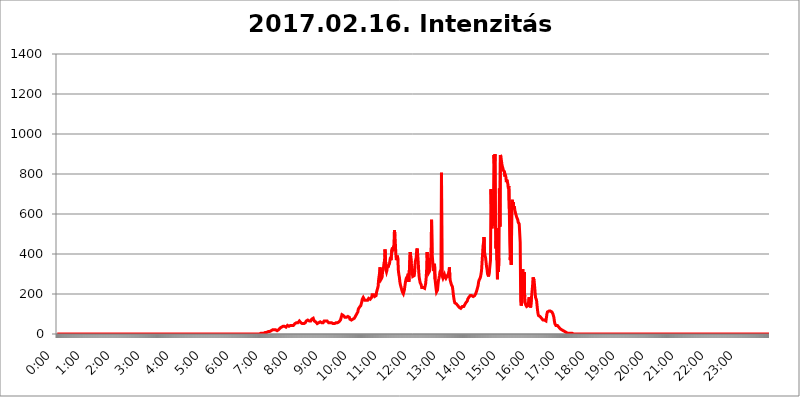
| Category | 2017.02.16. Intenzitás [W/m^2] |
|---|---|
| 0.0 | 0 |
| 0.0006944444444444445 | 0 |
| 0.001388888888888889 | 0 |
| 0.0020833333333333333 | 0 |
| 0.002777777777777778 | 0 |
| 0.003472222222222222 | 0 |
| 0.004166666666666667 | 0 |
| 0.004861111111111111 | 0 |
| 0.005555555555555556 | 0 |
| 0.0062499999999999995 | 0 |
| 0.006944444444444444 | 0 |
| 0.007638888888888889 | 0 |
| 0.008333333333333333 | 0 |
| 0.009027777777777779 | 0 |
| 0.009722222222222222 | 0 |
| 0.010416666666666666 | 0 |
| 0.011111111111111112 | 0 |
| 0.011805555555555555 | 0 |
| 0.012499999999999999 | 0 |
| 0.013194444444444444 | 0 |
| 0.013888888888888888 | 0 |
| 0.014583333333333332 | 0 |
| 0.015277777777777777 | 0 |
| 0.015972222222222224 | 0 |
| 0.016666666666666666 | 0 |
| 0.017361111111111112 | 0 |
| 0.018055555555555557 | 0 |
| 0.01875 | 0 |
| 0.019444444444444445 | 0 |
| 0.02013888888888889 | 0 |
| 0.020833333333333332 | 0 |
| 0.02152777777777778 | 0 |
| 0.022222222222222223 | 0 |
| 0.02291666666666667 | 0 |
| 0.02361111111111111 | 0 |
| 0.024305555555555556 | 0 |
| 0.024999999999999998 | 0 |
| 0.025694444444444447 | 0 |
| 0.02638888888888889 | 0 |
| 0.027083333333333334 | 0 |
| 0.027777777777777776 | 0 |
| 0.02847222222222222 | 0 |
| 0.029166666666666664 | 0 |
| 0.029861111111111113 | 0 |
| 0.030555555555555555 | 0 |
| 0.03125 | 0 |
| 0.03194444444444445 | 0 |
| 0.03263888888888889 | 0 |
| 0.03333333333333333 | 0 |
| 0.034027777777777775 | 0 |
| 0.034722222222222224 | 0 |
| 0.035416666666666666 | 0 |
| 0.036111111111111115 | 0 |
| 0.03680555555555556 | 0 |
| 0.0375 | 0 |
| 0.03819444444444444 | 0 |
| 0.03888888888888889 | 0 |
| 0.03958333333333333 | 0 |
| 0.04027777777777778 | 0 |
| 0.04097222222222222 | 0 |
| 0.041666666666666664 | 0 |
| 0.042361111111111106 | 0 |
| 0.04305555555555556 | 0 |
| 0.043750000000000004 | 0 |
| 0.044444444444444446 | 0 |
| 0.04513888888888889 | 0 |
| 0.04583333333333334 | 0 |
| 0.04652777777777778 | 0 |
| 0.04722222222222222 | 0 |
| 0.04791666666666666 | 0 |
| 0.04861111111111111 | 0 |
| 0.049305555555555554 | 0 |
| 0.049999999999999996 | 0 |
| 0.05069444444444445 | 0 |
| 0.051388888888888894 | 0 |
| 0.052083333333333336 | 0 |
| 0.05277777777777778 | 0 |
| 0.05347222222222222 | 0 |
| 0.05416666666666667 | 0 |
| 0.05486111111111111 | 0 |
| 0.05555555555555555 | 0 |
| 0.05625 | 0 |
| 0.05694444444444444 | 0 |
| 0.057638888888888885 | 0 |
| 0.05833333333333333 | 0 |
| 0.05902777777777778 | 0 |
| 0.059722222222222225 | 0 |
| 0.06041666666666667 | 0 |
| 0.061111111111111116 | 0 |
| 0.06180555555555556 | 0 |
| 0.0625 | 0 |
| 0.06319444444444444 | 0 |
| 0.06388888888888888 | 0 |
| 0.06458333333333334 | 0 |
| 0.06527777777777778 | 0 |
| 0.06597222222222222 | 0 |
| 0.06666666666666667 | 0 |
| 0.06736111111111111 | 0 |
| 0.06805555555555555 | 0 |
| 0.06874999999999999 | 0 |
| 0.06944444444444443 | 0 |
| 0.07013888888888889 | 0 |
| 0.07083333333333333 | 0 |
| 0.07152777777777779 | 0 |
| 0.07222222222222223 | 0 |
| 0.07291666666666667 | 0 |
| 0.07361111111111111 | 0 |
| 0.07430555555555556 | 0 |
| 0.075 | 0 |
| 0.07569444444444444 | 0 |
| 0.0763888888888889 | 0 |
| 0.07708333333333334 | 0 |
| 0.07777777777777778 | 0 |
| 0.07847222222222222 | 0 |
| 0.07916666666666666 | 0 |
| 0.0798611111111111 | 0 |
| 0.08055555555555556 | 0 |
| 0.08125 | 0 |
| 0.08194444444444444 | 0 |
| 0.08263888888888889 | 0 |
| 0.08333333333333333 | 0 |
| 0.08402777777777777 | 0 |
| 0.08472222222222221 | 0 |
| 0.08541666666666665 | 0 |
| 0.08611111111111112 | 0 |
| 0.08680555555555557 | 0 |
| 0.08750000000000001 | 0 |
| 0.08819444444444445 | 0 |
| 0.08888888888888889 | 0 |
| 0.08958333333333333 | 0 |
| 0.09027777777777778 | 0 |
| 0.09097222222222222 | 0 |
| 0.09166666666666667 | 0 |
| 0.09236111111111112 | 0 |
| 0.09305555555555556 | 0 |
| 0.09375 | 0 |
| 0.09444444444444444 | 0 |
| 0.09513888888888888 | 0 |
| 0.09583333333333333 | 0 |
| 0.09652777777777777 | 0 |
| 0.09722222222222222 | 0 |
| 0.09791666666666667 | 0 |
| 0.09861111111111111 | 0 |
| 0.09930555555555555 | 0 |
| 0.09999999999999999 | 0 |
| 0.10069444444444443 | 0 |
| 0.1013888888888889 | 0 |
| 0.10208333333333335 | 0 |
| 0.10277777777777779 | 0 |
| 0.10347222222222223 | 0 |
| 0.10416666666666667 | 0 |
| 0.10486111111111111 | 0 |
| 0.10555555555555556 | 0 |
| 0.10625 | 0 |
| 0.10694444444444444 | 0 |
| 0.1076388888888889 | 0 |
| 0.10833333333333334 | 0 |
| 0.10902777777777778 | 0 |
| 0.10972222222222222 | 0 |
| 0.1111111111111111 | 0 |
| 0.11180555555555556 | 0 |
| 0.11180555555555556 | 0 |
| 0.1125 | 0 |
| 0.11319444444444444 | 0 |
| 0.11388888888888889 | 0 |
| 0.11458333333333333 | 0 |
| 0.11527777777777777 | 0 |
| 0.11597222222222221 | 0 |
| 0.11666666666666665 | 0 |
| 0.1173611111111111 | 0 |
| 0.11805555555555557 | 0 |
| 0.11944444444444445 | 0 |
| 0.12013888888888889 | 0 |
| 0.12083333333333333 | 0 |
| 0.12152777777777778 | 0 |
| 0.12222222222222223 | 0 |
| 0.12291666666666667 | 0 |
| 0.12291666666666667 | 0 |
| 0.12361111111111112 | 0 |
| 0.12430555555555556 | 0 |
| 0.125 | 0 |
| 0.12569444444444444 | 0 |
| 0.12638888888888888 | 0 |
| 0.12708333333333333 | 0 |
| 0.16875 | 0 |
| 0.12847222222222224 | 0 |
| 0.12916666666666668 | 0 |
| 0.12986111111111112 | 0 |
| 0.13055555555555556 | 0 |
| 0.13125 | 0 |
| 0.13194444444444445 | 0 |
| 0.1326388888888889 | 0 |
| 0.13333333333333333 | 0 |
| 0.13402777777777777 | 0 |
| 0.13402777777777777 | 0 |
| 0.13472222222222222 | 0 |
| 0.13541666666666666 | 0 |
| 0.1361111111111111 | 0 |
| 0.13749999999999998 | 0 |
| 0.13819444444444443 | 0 |
| 0.1388888888888889 | 0 |
| 0.13958333333333334 | 0 |
| 0.14027777777777778 | 0 |
| 0.14097222222222222 | 0 |
| 0.14166666666666666 | 0 |
| 0.1423611111111111 | 0 |
| 0.14305555555555557 | 0 |
| 0.14375000000000002 | 0 |
| 0.14444444444444446 | 0 |
| 0.1451388888888889 | 0 |
| 0.1451388888888889 | 0 |
| 0.14652777777777778 | 0 |
| 0.14722222222222223 | 0 |
| 0.14791666666666667 | 0 |
| 0.1486111111111111 | 0 |
| 0.14930555555555555 | 0 |
| 0.15 | 0 |
| 0.15069444444444444 | 0 |
| 0.15138888888888888 | 0 |
| 0.15208333333333332 | 0 |
| 0.15277777777777776 | 0 |
| 0.15347222222222223 | 0 |
| 0.15416666666666667 | 0 |
| 0.15486111111111112 | 0 |
| 0.15555555555555556 | 0 |
| 0.15625 | 0 |
| 0.15694444444444444 | 0 |
| 0.15763888888888888 | 0 |
| 0.15833333333333333 | 0 |
| 0.15902777777777777 | 0 |
| 0.15972222222222224 | 0 |
| 0.16041666666666668 | 0 |
| 0.16111111111111112 | 0 |
| 0.16180555555555556 | 0 |
| 0.1625 | 0 |
| 0.16319444444444445 | 0 |
| 0.1638888888888889 | 0 |
| 0.16458333333333333 | 0 |
| 0.16527777777777777 | 0 |
| 0.16597222222222222 | 0 |
| 0.16666666666666666 | 0 |
| 0.1673611111111111 | 0 |
| 0.16805555555555554 | 0 |
| 0.16874999999999998 | 0 |
| 0.16944444444444443 | 0 |
| 0.17013888888888887 | 0 |
| 0.1708333333333333 | 0 |
| 0.17152777777777775 | 0 |
| 0.17222222222222225 | 0 |
| 0.1729166666666667 | 0 |
| 0.17361111111111113 | 0 |
| 0.17430555555555557 | 0 |
| 0.17500000000000002 | 0 |
| 0.17569444444444446 | 0 |
| 0.1763888888888889 | 0 |
| 0.17708333333333334 | 0 |
| 0.17777777777777778 | 0 |
| 0.17847222222222223 | 0 |
| 0.17916666666666667 | 0 |
| 0.1798611111111111 | 0 |
| 0.18055555555555555 | 0 |
| 0.18125 | 0 |
| 0.18194444444444444 | 0 |
| 0.1826388888888889 | 0 |
| 0.18333333333333335 | 0 |
| 0.1840277777777778 | 0 |
| 0.18472222222222223 | 0 |
| 0.18541666666666667 | 0 |
| 0.18611111111111112 | 0 |
| 0.18680555555555556 | 0 |
| 0.1875 | 0 |
| 0.18819444444444444 | 0 |
| 0.18888888888888888 | 0 |
| 0.18958333333333333 | 0 |
| 0.19027777777777777 | 0 |
| 0.1909722222222222 | 0 |
| 0.19166666666666665 | 0 |
| 0.19236111111111112 | 0 |
| 0.19305555555555554 | 0 |
| 0.19375 | 0 |
| 0.19444444444444445 | 0 |
| 0.1951388888888889 | 0 |
| 0.19583333333333333 | 0 |
| 0.19652777777777777 | 0 |
| 0.19722222222222222 | 0 |
| 0.19791666666666666 | 0 |
| 0.1986111111111111 | 0 |
| 0.19930555555555554 | 0 |
| 0.19999999999999998 | 0 |
| 0.20069444444444443 | 0 |
| 0.20138888888888887 | 0 |
| 0.2020833333333333 | 0 |
| 0.2027777777777778 | 0 |
| 0.2034722222222222 | 0 |
| 0.2041666666666667 | 0 |
| 0.20486111111111113 | 0 |
| 0.20555555555555557 | 0 |
| 0.20625000000000002 | 0 |
| 0.20694444444444446 | 0 |
| 0.2076388888888889 | 0 |
| 0.20833333333333334 | 0 |
| 0.20902777777777778 | 0 |
| 0.20972222222222223 | 0 |
| 0.21041666666666667 | 0 |
| 0.2111111111111111 | 0 |
| 0.21180555555555555 | 0 |
| 0.2125 | 0 |
| 0.21319444444444444 | 0 |
| 0.2138888888888889 | 0 |
| 0.21458333333333335 | 0 |
| 0.2152777777777778 | 0 |
| 0.21597222222222223 | 0 |
| 0.21666666666666667 | 0 |
| 0.21736111111111112 | 0 |
| 0.21805555555555556 | 0 |
| 0.21875 | 0 |
| 0.21944444444444444 | 0 |
| 0.22013888888888888 | 0 |
| 0.22083333333333333 | 0 |
| 0.22152777777777777 | 0 |
| 0.2222222222222222 | 0 |
| 0.22291666666666665 | 0 |
| 0.2236111111111111 | 0 |
| 0.22430555555555556 | 0 |
| 0.225 | 0 |
| 0.22569444444444445 | 0 |
| 0.2263888888888889 | 0 |
| 0.22708333333333333 | 0 |
| 0.22777777777777777 | 0 |
| 0.22847222222222222 | 0 |
| 0.22916666666666666 | 0 |
| 0.2298611111111111 | 0 |
| 0.23055555555555554 | 0 |
| 0.23124999999999998 | 0 |
| 0.23194444444444443 | 0 |
| 0.23263888888888887 | 0 |
| 0.2333333333333333 | 0 |
| 0.2340277777777778 | 0 |
| 0.2347222222222222 | 0 |
| 0.2354166666666667 | 0 |
| 0.23611111111111113 | 0 |
| 0.23680555555555557 | 0 |
| 0.23750000000000002 | 0 |
| 0.23819444444444446 | 0 |
| 0.2388888888888889 | 0 |
| 0.23958333333333334 | 0 |
| 0.24027777777777778 | 0 |
| 0.24097222222222223 | 0 |
| 0.24166666666666667 | 0 |
| 0.2423611111111111 | 0 |
| 0.24305555555555555 | 0 |
| 0.24375 | 0 |
| 0.24444444444444446 | 0 |
| 0.24513888888888888 | 0 |
| 0.24583333333333335 | 0 |
| 0.2465277777777778 | 0 |
| 0.24722222222222223 | 0 |
| 0.24791666666666667 | 0 |
| 0.24861111111111112 | 0 |
| 0.24930555555555556 | 0 |
| 0.25 | 0 |
| 0.25069444444444444 | 0 |
| 0.2513888888888889 | 0 |
| 0.2520833333333333 | 0 |
| 0.25277777777777777 | 0 |
| 0.2534722222222222 | 0 |
| 0.25416666666666665 | 0 |
| 0.2548611111111111 | 0 |
| 0.2555555555555556 | 0 |
| 0.25625000000000003 | 0 |
| 0.2569444444444445 | 0 |
| 0.2576388888888889 | 0 |
| 0.25833333333333336 | 0 |
| 0.2590277777777778 | 0 |
| 0.25972222222222224 | 0 |
| 0.2604166666666667 | 0 |
| 0.2611111111111111 | 0 |
| 0.26180555555555557 | 0 |
| 0.2625 | 0 |
| 0.26319444444444445 | 0 |
| 0.2638888888888889 | 0 |
| 0.26458333333333334 | 0 |
| 0.2652777777777778 | 0 |
| 0.2659722222222222 | 0 |
| 0.26666666666666666 | 0 |
| 0.2673611111111111 | 0 |
| 0.26805555555555555 | 0 |
| 0.26875 | 0 |
| 0.26944444444444443 | 0 |
| 0.2701388888888889 | 0 |
| 0.2708333333333333 | 0 |
| 0.27152777777777776 | 0 |
| 0.2722222222222222 | 0 |
| 0.27291666666666664 | 0 |
| 0.2736111111111111 | 0 |
| 0.2743055555555555 | 0 |
| 0.27499999999999997 | 0 |
| 0.27569444444444446 | 0 |
| 0.27638888888888885 | 0 |
| 0.27708333333333335 | 0 |
| 0.2777777777777778 | 0 |
| 0.27847222222222223 | 0 |
| 0.2791666666666667 | 0 |
| 0.2798611111111111 | 0 |
| 0.28055555555555556 | 0 |
| 0.28125 | 0 |
| 0.28194444444444444 | 0 |
| 0.2826388888888889 | 0 |
| 0.2833333333333333 | 0 |
| 0.28402777777777777 | 3.525 |
| 0.2847222222222222 | 0 |
| 0.28541666666666665 | 3.525 |
| 0.28611111111111115 | 3.525 |
| 0.28680555555555554 | 3.525 |
| 0.28750000000000003 | 3.525 |
| 0.2881944444444445 | 3.525 |
| 0.2888888888888889 | 3.525 |
| 0.28958333333333336 | 3.525 |
| 0.2902777777777778 | 3.525 |
| 0.29097222222222224 | 7.887 |
| 0.2916666666666667 | 7.887 |
| 0.2923611111111111 | 7.887 |
| 0.29305555555555557 | 7.887 |
| 0.29375 | 7.887 |
| 0.29444444444444445 | 7.887 |
| 0.2951388888888889 | 7.887 |
| 0.29583333333333334 | 12.257 |
| 0.2965277777777778 | 12.257 |
| 0.2972222222222222 | 12.257 |
| 0.29791666666666666 | 12.257 |
| 0.2986111111111111 | 12.257 |
| 0.29930555555555555 | 16.636 |
| 0.3 | 16.636 |
| 0.30069444444444443 | 16.636 |
| 0.3013888888888889 | 16.636 |
| 0.3020833333333333 | 21.024 |
| 0.30277777777777776 | 21.024 |
| 0.3034722222222222 | 21.024 |
| 0.30416666666666664 | 21.024 |
| 0.3048611111111111 | 16.636 |
| 0.3055555555555555 | 16.636 |
| 0.30624999999999997 | 21.024 |
| 0.3069444444444444 | 21.024 |
| 0.3076388888888889 | 16.636 |
| 0.30833333333333335 | 16.636 |
| 0.3090277777777778 | 16.636 |
| 0.30972222222222223 | 21.024 |
| 0.3104166666666667 | 21.024 |
| 0.3111111111111111 | 25.419 |
| 0.31180555555555556 | 25.419 |
| 0.3125 | 29.823 |
| 0.31319444444444444 | 29.823 |
| 0.3138888888888889 | 29.823 |
| 0.3145833333333333 | 34.234 |
| 0.31527777777777777 | 34.234 |
| 0.3159722222222222 | 38.653 |
| 0.31666666666666665 | 38.653 |
| 0.31736111111111115 | 38.653 |
| 0.31805555555555554 | 38.653 |
| 0.31875000000000003 | 38.653 |
| 0.3194444444444445 | 34.234 |
| 0.3201388888888889 | 34.234 |
| 0.32083333333333336 | 34.234 |
| 0.3215277777777778 | 38.653 |
| 0.32222222222222224 | 38.653 |
| 0.3229166666666667 | 43.079 |
| 0.3236111111111111 | 43.079 |
| 0.32430555555555557 | 43.079 |
| 0.325 | 38.653 |
| 0.32569444444444445 | 38.653 |
| 0.3263888888888889 | 38.653 |
| 0.32708333333333334 | 43.079 |
| 0.3277777777777778 | 43.079 |
| 0.3284722222222222 | 43.079 |
| 0.32916666666666666 | 43.079 |
| 0.3298611111111111 | 43.079 |
| 0.33055555555555555 | 43.079 |
| 0.33125 | 43.079 |
| 0.33194444444444443 | 47.511 |
| 0.3326388888888889 | 47.511 |
| 0.3333333333333333 | 51.951 |
| 0.3340277777777778 | 51.951 |
| 0.3347222222222222 | 51.951 |
| 0.3354166666666667 | 56.398 |
| 0.3361111111111111 | 56.398 |
| 0.3368055555555556 | 60.85 |
| 0.33749999999999997 | 56.398 |
| 0.33819444444444446 | 60.85 |
| 0.33888888888888885 | 60.85 |
| 0.33958333333333335 | 65.31 |
| 0.34027777777777773 | 65.31 |
| 0.34097222222222223 | 60.85 |
| 0.3416666666666666 | 56.398 |
| 0.3423611111111111 | 56.398 |
| 0.3430555555555555 | 51.951 |
| 0.34375 | 51.951 |
| 0.3444444444444445 | 51.951 |
| 0.3451388888888889 | 51.951 |
| 0.3458333333333334 | 51.951 |
| 0.34652777777777777 | 51.951 |
| 0.34722222222222227 | 56.398 |
| 0.34791666666666665 | 56.398 |
| 0.34861111111111115 | 60.85 |
| 0.34930555555555554 | 65.31 |
| 0.35000000000000003 | 65.31 |
| 0.3506944444444444 | 65.31 |
| 0.3513888888888889 | 69.775 |
| 0.3520833333333333 | 69.775 |
| 0.3527777777777778 | 69.775 |
| 0.3534722222222222 | 65.31 |
| 0.3541666666666667 | 65.31 |
| 0.3548611111111111 | 69.775 |
| 0.35555555555555557 | 65.31 |
| 0.35625 | 65.31 |
| 0.35694444444444445 | 74.246 |
| 0.3576388888888889 | 78.722 |
| 0.35833333333333334 | 78.722 |
| 0.3590277777777778 | 78.722 |
| 0.3597222222222222 | 74.246 |
| 0.36041666666666666 | 65.31 |
| 0.3611111111111111 | 65.31 |
| 0.36180555555555555 | 60.85 |
| 0.3625 | 60.85 |
| 0.36319444444444443 | 56.398 |
| 0.3638888888888889 | 56.398 |
| 0.3645833333333333 | 51.951 |
| 0.3652777777777778 | 51.951 |
| 0.3659722222222222 | 56.398 |
| 0.3666666666666667 | 56.398 |
| 0.3673611111111111 | 60.85 |
| 0.3680555555555556 | 60.85 |
| 0.36874999999999997 | 60.85 |
| 0.36944444444444446 | 60.85 |
| 0.37013888888888885 | 56.398 |
| 0.37083333333333335 | 56.398 |
| 0.37152777777777773 | 56.398 |
| 0.37222222222222223 | 56.398 |
| 0.3729166666666666 | 56.398 |
| 0.3736111111111111 | 60.85 |
| 0.3743055555555555 | 65.31 |
| 0.375 | 65.31 |
| 0.3756944444444445 | 65.31 |
| 0.3763888888888889 | 65.31 |
| 0.3770833333333334 | 65.31 |
| 0.37777777777777777 | 65.31 |
| 0.37847222222222227 | 65.31 |
| 0.37916666666666665 | 60.85 |
| 0.37986111111111115 | 60.85 |
| 0.38055555555555554 | 56.398 |
| 0.38125000000000003 | 56.398 |
| 0.3819444444444444 | 56.398 |
| 0.3826388888888889 | 56.398 |
| 0.3833333333333333 | 56.398 |
| 0.3840277777777778 | 56.398 |
| 0.3847222222222222 | 56.398 |
| 0.3854166666666667 | 51.951 |
| 0.3861111111111111 | 51.951 |
| 0.38680555555555557 | 51.951 |
| 0.3875 | 51.951 |
| 0.38819444444444445 | 47.511 |
| 0.3888888888888889 | 51.951 |
| 0.38958333333333334 | 51.951 |
| 0.3902777777777778 | 56.398 |
| 0.3909722222222222 | 56.398 |
| 0.39166666666666666 | 51.951 |
| 0.3923611111111111 | 51.951 |
| 0.39305555555555555 | 56.398 |
| 0.39375 | 56.398 |
| 0.39444444444444443 | 60.85 |
| 0.3951388888888889 | 60.85 |
| 0.3958333333333333 | 60.85 |
| 0.3965277777777778 | 65.31 |
| 0.3972222222222222 | 69.775 |
| 0.3979166666666667 | 74.246 |
| 0.3986111111111111 | 87.692 |
| 0.3993055555555556 | 96.682 |
| 0.39999999999999997 | 101.184 |
| 0.40069444444444446 | 96.682 |
| 0.40138888888888885 | 92.184 |
| 0.40208333333333335 | 92.184 |
| 0.40277777777777773 | 87.692 |
| 0.40347222222222223 | 83.205 |
| 0.4041666666666666 | 83.205 |
| 0.4048611111111111 | 83.205 |
| 0.4055555555555555 | 83.205 |
| 0.40625 | 83.205 |
| 0.4069444444444445 | 83.205 |
| 0.4076388888888889 | 87.692 |
| 0.4083333333333334 | 87.692 |
| 0.40902777777777777 | 87.692 |
| 0.40972222222222227 | 83.205 |
| 0.41041666666666665 | 74.246 |
| 0.41111111111111115 | 74.246 |
| 0.41180555555555554 | 69.775 |
| 0.41250000000000003 | 69.775 |
| 0.4131944444444444 | 74.246 |
| 0.4138888888888889 | 74.246 |
| 0.4145833333333333 | 74.246 |
| 0.4152777777777778 | 74.246 |
| 0.4159722222222222 | 78.722 |
| 0.4166666666666667 | 78.722 |
| 0.4173611111111111 | 83.205 |
| 0.41805555555555557 | 87.692 |
| 0.41875 | 92.184 |
| 0.41944444444444445 | 96.682 |
| 0.4201388888888889 | 96.682 |
| 0.42083333333333334 | 92.184 |
| 0.4215277777777778 | 110.201 |
| 0.4222222222222222 | 123.758 |
| 0.42291666666666666 | 128.284 |
| 0.4236111111111111 | 132.814 |
| 0.42430555555555555 | 128.284 |
| 0.425 | 132.814 |
| 0.42569444444444443 | 141.884 |
| 0.4263888888888889 | 150.964 |
| 0.4270833333333333 | 160.056 |
| 0.4277777777777778 | 173.709 |
| 0.4284722222222222 | 178.264 |
| 0.4291666666666667 | 182.82 |
| 0.4298611111111111 | 178.264 |
| 0.4305555555555556 | 178.264 |
| 0.43124999999999997 | 169.156 |
| 0.43194444444444446 | 164.605 |
| 0.43263888888888885 | 164.605 |
| 0.43333333333333335 | 169.156 |
| 0.43402777777777773 | 169.156 |
| 0.43472222222222223 | 169.156 |
| 0.4354166666666666 | 169.156 |
| 0.4361111111111111 | 173.709 |
| 0.4368055555555555 | 178.264 |
| 0.4375 | 173.709 |
| 0.4381944444444445 | 173.709 |
| 0.4388888888888889 | 173.709 |
| 0.4395833333333334 | 173.709 |
| 0.44027777777777777 | 173.709 |
| 0.44097222222222227 | 182.82 |
| 0.44166666666666665 | 196.497 |
| 0.44236111111111115 | 201.058 |
| 0.44305555555555554 | 201.058 |
| 0.44375000000000003 | 196.497 |
| 0.4444444444444444 | 191.937 |
| 0.4451388888888889 | 187.378 |
| 0.4458333333333333 | 187.378 |
| 0.4465277777777778 | 191.937 |
| 0.4472222222222222 | 191.937 |
| 0.4479166666666667 | 210.182 |
| 0.4486111111111111 | 219.309 |
| 0.44930555555555557 | 219.309 |
| 0.45 | 237.564 |
| 0.45069444444444445 | 269.49 |
| 0.4513888888888889 | 287.709 |
| 0.45208333333333334 | 305.898 |
| 0.4527777777777778 | 333.113 |
| 0.4534722222222222 | 287.709 |
| 0.45416666666666666 | 274.047 |
| 0.4548611111111111 | 269.49 |
| 0.45555555555555555 | 283.156 |
| 0.45625 | 310.44 |
| 0.45694444444444443 | 324.052 |
| 0.4576388888888889 | 333.113 |
| 0.4583333333333333 | 355.712 |
| 0.4590277777777778 | 364.728 |
| 0.4597222222222222 | 422.943 |
| 0.4604166666666667 | 418.492 |
| 0.4611111111111111 | 319.517 |
| 0.4618055555555556 | 310.44 |
| 0.46249999999999997 | 319.517 |
| 0.46319444444444446 | 346.682 |
| 0.46388888888888885 | 333.113 |
| 0.46458333333333335 | 342.162 |
| 0.46527777777777773 | 337.639 |
| 0.46597222222222223 | 351.198 |
| 0.4666666666666666 | 369.23 |
| 0.4673611111111111 | 382.715 |
| 0.4680555555555555 | 369.23 |
| 0.46875 | 364.728 |
| 0.4694444444444445 | 422.943 |
| 0.4701388888888889 | 431.833 |
| 0.4708333333333334 | 414.035 |
| 0.47152777777777777 | 436.27 |
| 0.47222222222222227 | 445.129 |
| 0.47291666666666665 | 519.555 |
| 0.47361111111111115 | 493.475 |
| 0.47430555555555554 | 445.129 |
| 0.47500000000000003 | 391.685 |
| 0.4756944444444444 | 369.23 |
| 0.4763888888888889 | 373.729 |
| 0.4770833333333333 | 391.685 |
| 0.4777777777777778 | 369.23 |
| 0.4784722222222222 | 314.98 |
| 0.4791666666666667 | 296.808 |
| 0.4798611111111111 | 283.156 |
| 0.48055555555555557 | 260.373 |
| 0.48125 | 246.689 |
| 0.48194444444444445 | 237.564 |
| 0.4826388888888889 | 228.436 |
| 0.48333333333333334 | 219.309 |
| 0.4840277777777778 | 210.182 |
| 0.4847222222222222 | 205.62 |
| 0.48541666666666666 | 201.058 |
| 0.4861111111111111 | 205.62 |
| 0.48680555555555555 | 219.309 |
| 0.4875 | 237.564 |
| 0.48819444444444443 | 255.813 |
| 0.4888888888888889 | 269.49 |
| 0.4895833333333333 | 278.603 |
| 0.4902777777777778 | 278.603 |
| 0.4909722222222222 | 274.047 |
| 0.4916666666666667 | 292.259 |
| 0.4923611111111111 | 301.354 |
| 0.4930555555555556 | 260.373 |
| 0.49374999999999997 | 255.813 |
| 0.49444444444444446 | 260.373 |
| 0.49513888888888885 | 409.574 |
| 0.49583333333333335 | 405.108 |
| 0.49652777777777773 | 355.712 |
| 0.49722222222222223 | 333.113 |
| 0.4979166666666666 | 305.898 |
| 0.4986111111111111 | 287.709 |
| 0.4993055555555555 | 283.156 |
| 0.5 | 292.259 |
| 0.5006944444444444 | 292.259 |
| 0.5013888888888889 | 314.98 |
| 0.5020833333333333 | 360.221 |
| 0.5027777777777778 | 355.712 |
| 0.5034722222222222 | 382.715 |
| 0.5041666666666667 | 418.492 |
| 0.5048611111111111 | 427.39 |
| 0.5055555555555555 | 396.164 |
| 0.50625 | 360.221 |
| 0.5069444444444444 | 314.98 |
| 0.5076388888888889 | 283.156 |
| 0.5083333333333333 | 269.49 |
| 0.5090277777777777 | 255.813 |
| 0.5097222222222222 | 260.373 |
| 0.5104166666666666 | 246.689 |
| 0.5111111111111112 | 233 |
| 0.5118055555555555 | 228.436 |
| 0.5125000000000001 | 228.436 |
| 0.5131944444444444 | 233 |
| 0.513888888888889 | 228.436 |
| 0.5145833333333333 | 228.436 |
| 0.5152777777777778 | 228.436 |
| 0.5159722222222222 | 233 |
| 0.5166666666666667 | 251.251 |
| 0.517361111111111 | 278.603 |
| 0.5180555555555556 | 319.517 |
| 0.5187499999999999 | 409.574 |
| 0.5194444444444445 | 355.712 |
| 0.5201388888888888 | 324.052 |
| 0.5208333333333334 | 305.898 |
| 0.5215277777777778 | 301.354 |
| 0.5222222222222223 | 314.98 |
| 0.5229166666666667 | 346.682 |
| 0.5236111111111111 | 378.224 |
| 0.5243055555555556 | 414.035 |
| 0.525 | 571.049 |
| 0.5256944444444445 | 405.108 |
| 0.5263888888888889 | 373.729 |
| 0.5270833333333333 | 342.162 |
| 0.5277777777777778 | 314.98 |
| 0.5284722222222222 | 333.113 |
| 0.5291666666666667 | 351.198 |
| 0.5298611111111111 | 274.047 |
| 0.5305555555555556 | 251.251 |
| 0.53125 | 228.436 |
| 0.5319444444444444 | 210.182 |
| 0.5326388888888889 | 205.62 |
| 0.5333333333333333 | 219.309 |
| 0.5340277777777778 | 246.689 |
| 0.5347222222222222 | 269.49 |
| 0.5354166666666667 | 278.603 |
| 0.5361111111111111 | 292.259 |
| 0.5368055555555555 | 310.44 |
| 0.5375 | 305.898 |
| 0.5381944444444444 | 324.052 |
| 0.5388888888888889 | 806.757 |
| 0.5395833333333333 | 292.259 |
| 0.5402777777777777 | 292.259 |
| 0.5409722222222222 | 278.603 |
| 0.5416666666666666 | 283.156 |
| 0.5423611111111112 | 278.603 |
| 0.5430555555555555 | 296.808 |
| 0.5437500000000001 | 287.709 |
| 0.5444444444444444 | 283.156 |
| 0.545138888888889 | 278.603 |
| 0.5458333333333333 | 274.047 |
| 0.5465277777777778 | 278.603 |
| 0.5472222222222222 | 292.259 |
| 0.5479166666666667 | 296.808 |
| 0.548611111111111 | 301.354 |
| 0.5493055555555556 | 314.98 |
| 0.5499999999999999 | 333.113 |
| 0.5506944444444445 | 278.603 |
| 0.5513888888888888 | 264.932 |
| 0.5520833333333334 | 260.373 |
| 0.5527777777777778 | 246.689 |
| 0.5534722222222223 | 242.127 |
| 0.5541666666666667 | 237.564 |
| 0.5548611111111111 | 219.309 |
| 0.5555555555555556 | 196.497 |
| 0.55625 | 178.264 |
| 0.5569444444444445 | 164.605 |
| 0.5576388888888889 | 155.509 |
| 0.5583333333333333 | 155.509 |
| 0.5590277777777778 | 155.509 |
| 0.5597222222222222 | 150.964 |
| 0.5604166666666667 | 150.964 |
| 0.5611111111111111 | 146.423 |
| 0.5618055555555556 | 141.884 |
| 0.5625 | 137.347 |
| 0.5631944444444444 | 137.347 |
| 0.5638888888888889 | 132.814 |
| 0.5645833333333333 | 132.814 |
| 0.5652777777777778 | 128.284 |
| 0.5659722222222222 | 128.284 |
| 0.5666666666666667 | 132.814 |
| 0.5673611111111111 | 132.814 |
| 0.5680555555555555 | 137.347 |
| 0.56875 | 137.347 |
| 0.5694444444444444 | 137.347 |
| 0.5701388888888889 | 137.347 |
| 0.5708333333333333 | 141.884 |
| 0.5715277777777777 | 146.423 |
| 0.5722222222222222 | 150.964 |
| 0.5729166666666666 | 155.509 |
| 0.5736111111111112 | 160.056 |
| 0.5743055555555555 | 160.056 |
| 0.5750000000000001 | 164.605 |
| 0.5756944444444444 | 173.709 |
| 0.576388888888889 | 178.264 |
| 0.5770833333333333 | 182.82 |
| 0.5777777777777778 | 187.378 |
| 0.5784722222222222 | 187.378 |
| 0.5791666666666667 | 191.937 |
| 0.579861111111111 | 196.497 |
| 0.5805555555555556 | 196.497 |
| 0.5812499999999999 | 191.937 |
| 0.5819444444444445 | 191.937 |
| 0.5826388888888888 | 187.378 |
| 0.5833333333333334 | 187.378 |
| 0.5840277777777778 | 191.937 |
| 0.5847222222222223 | 191.937 |
| 0.5854166666666667 | 191.937 |
| 0.5861111111111111 | 196.497 |
| 0.5868055555555556 | 201.058 |
| 0.5875 | 205.62 |
| 0.5881944444444445 | 214.746 |
| 0.5888888888888889 | 223.873 |
| 0.5895833333333333 | 233 |
| 0.5902777777777778 | 242.127 |
| 0.5909722222222222 | 260.373 |
| 0.5916666666666667 | 269.49 |
| 0.5923611111111111 | 274.047 |
| 0.5930555555555556 | 278.603 |
| 0.59375 | 287.709 |
| 0.5944444444444444 | 301.354 |
| 0.5951388888888889 | 319.517 |
| 0.5958333333333333 | 360.221 |
| 0.5965277777777778 | 400.638 |
| 0.5972222222222222 | 440.702 |
| 0.5979166666666667 | 458.38 |
| 0.5986111111111111 | 484.735 |
| 0.5993055555555555 | 409.574 |
| 0.6 | 391.685 |
| 0.6006944444444444 | 382.715 |
| 0.6013888888888889 | 378.224 |
| 0.6020833333333333 | 337.639 |
| 0.6027777777777777 | 324.052 |
| 0.6034722222222222 | 301.354 |
| 0.6041666666666666 | 296.808 |
| 0.6048611111111112 | 287.709 |
| 0.6055555555555555 | 292.259 |
| 0.6062500000000001 | 319.517 |
| 0.6069444444444444 | 314.98 |
| 0.607638888888889 | 369.23 |
| 0.6083333333333333 | 723.889 |
| 0.6090277777777778 | 629.948 |
| 0.6097222222222222 | 528.2 |
| 0.6104166666666667 | 621.613 |
| 0.611111111111111 | 541.121 |
| 0.6118055555555556 | 625.784 |
| 0.6124999999999999 | 894.885 |
| 0.6131944444444445 | 845.365 |
| 0.6138888888888888 | 898.668 |
| 0.6145833333333334 | 553.986 |
| 0.6152777777777778 | 427.39 |
| 0.6159722222222223 | 528.2 |
| 0.6166666666666667 | 369.23 |
| 0.6173611111111111 | 274.047 |
| 0.6180555555555556 | 369.23 |
| 0.61875 | 310.44 |
| 0.6194444444444445 | 378.224 |
| 0.6201388888888889 | 727.896 |
| 0.6208333333333333 | 536.82 |
| 0.6215277777777778 | 894.885 |
| 0.6222222222222222 | 887.309 |
| 0.6229166666666667 | 868.305 |
| 0.6236111111111111 | 849.199 |
| 0.6243055555555556 | 837.682 |
| 0.625 | 829.981 |
| 0.6256944444444444 | 818.392 |
| 0.6263888888888889 | 818.392 |
| 0.6270833333333333 | 810.641 |
| 0.6277777777777778 | 787.258 |
| 0.6284722222222222 | 795.074 |
| 0.6291666666666667 | 787.258 |
| 0.6298611111111111 | 759.723 |
| 0.6305555555555555 | 771.559 |
| 0.63125 | 759.723 |
| 0.6319444444444444 | 751.803 |
| 0.6326388888888889 | 727.896 |
| 0.6333333333333333 | 739.877 |
| 0.6340277777777777 | 625.784 |
| 0.6347222222222222 | 453.968 |
| 0.6354166666666666 | 369.23 |
| 0.6361111111111112 | 458.38 |
| 0.6368055555555555 | 346.682 |
| 0.6375000000000001 | 638.256 |
| 0.6381944444444444 | 671.22 |
| 0.638888888888889 | 625.784 |
| 0.6395833333333333 | 658.909 |
| 0.6402777777777778 | 625.784 |
| 0.6409722222222222 | 638.256 |
| 0.6416666666666667 | 621.613 |
| 0.642361111111111 | 609.062 |
| 0.6430555555555556 | 604.864 |
| 0.6437499999999999 | 592.233 |
| 0.6444444444444445 | 583.779 |
| 0.6451388888888888 | 583.779 |
| 0.6458333333333334 | 571.049 |
| 0.6465277777777778 | 558.261 |
| 0.6472222222222223 | 553.986 |
| 0.6479166666666667 | 549.704 |
| 0.6486111111111111 | 549.704 |
| 0.6493055555555556 | 458.38 |
| 0.65 | 164.605 |
| 0.6506944444444445 | 141.884 |
| 0.6513888888888889 | 146.423 |
| 0.6520833333333333 | 164.605 |
| 0.6527777777777778 | 324.052 |
| 0.6534722222222222 | 283.156 |
| 0.6541666666666667 | 191.937 |
| 0.6548611111111111 | 310.44 |
| 0.6555555555555556 | 187.378 |
| 0.65625 | 160.056 |
| 0.6569444444444444 | 146.423 |
| 0.6576388888888889 | 141.884 |
| 0.6583333333333333 | 137.347 |
| 0.6590277777777778 | 137.347 |
| 0.6597222222222222 | 137.347 |
| 0.6604166666666667 | 141.884 |
| 0.6611111111111111 | 146.423 |
| 0.6618055555555555 | 182.82 |
| 0.6625 | 146.423 |
| 0.6631944444444444 | 182.82 |
| 0.6638888888888889 | 132.814 |
| 0.6645833333333333 | 132.814 |
| 0.6652777777777777 | 187.378 |
| 0.6659722222222222 | 182.82 |
| 0.6666666666666666 | 242.127 |
| 0.6673611111111111 | 283.156 |
| 0.6680555555555556 | 287.709 |
| 0.6687500000000001 | 269.49 |
| 0.6694444444444444 | 242.127 |
| 0.6701388888888888 | 210.182 |
| 0.6708333333333334 | 182.82 |
| 0.6715277777777778 | 178.264 |
| 0.6722222222222222 | 169.156 |
| 0.6729166666666666 | 164.605 |
| 0.6736111111111112 | 119.235 |
| 0.6743055555555556 | 101.184 |
| 0.6749999999999999 | 92.184 |
| 0.6756944444444444 | 92.184 |
| 0.6763888888888889 | 87.692 |
| 0.6770833333333334 | 87.692 |
| 0.6777777777777777 | 83.205 |
| 0.6784722222222223 | 83.205 |
| 0.6791666666666667 | 78.722 |
| 0.6798611111111111 | 74.246 |
| 0.6805555555555555 | 74.246 |
| 0.68125 | 69.775 |
| 0.6819444444444445 | 69.775 |
| 0.6826388888888889 | 69.775 |
| 0.6833333333333332 | 69.775 |
| 0.6840277777777778 | 65.31 |
| 0.6847222222222222 | 65.31 |
| 0.6854166666666667 | 65.31 |
| 0.686111111111111 | 83.205 |
| 0.6868055555555556 | 101.184 |
| 0.6875 | 110.201 |
| 0.6881944444444444 | 114.716 |
| 0.688888888888889 | 114.716 |
| 0.6895833333333333 | 114.716 |
| 0.6902777777777778 | 114.716 |
| 0.6909722222222222 | 114.716 |
| 0.6916666666666668 | 114.716 |
| 0.6923611111111111 | 114.716 |
| 0.6930555555555555 | 110.201 |
| 0.69375 | 110.201 |
| 0.6944444444444445 | 105.69 |
| 0.6951388888888889 | 101.184 |
| 0.6958333333333333 | 92.184 |
| 0.6965277777777777 | 83.205 |
| 0.6972222222222223 | 65.31 |
| 0.6979166666666666 | 51.951 |
| 0.6986111111111111 | 47.511 |
| 0.6993055555555556 | 43.079 |
| 0.7000000000000001 | 43.079 |
| 0.7006944444444444 | 43.079 |
| 0.7013888888888888 | 43.079 |
| 0.7020833333333334 | 38.653 |
| 0.7027777777777778 | 38.653 |
| 0.7034722222222222 | 34.234 |
| 0.7041666666666666 | 29.823 |
| 0.7048611111111112 | 29.823 |
| 0.7055555555555556 | 25.419 |
| 0.7062499999999999 | 21.024 |
| 0.7069444444444444 | 21.024 |
| 0.7076388888888889 | 21.024 |
| 0.7083333333333334 | 16.636 |
| 0.7090277777777777 | 16.636 |
| 0.7097222222222223 | 16.636 |
| 0.7104166666666667 | 12.257 |
| 0.7111111111111111 | 12.257 |
| 0.7118055555555555 | 12.257 |
| 0.7125 | 12.257 |
| 0.7131944444444445 | 7.887 |
| 0.7138888888888889 | 7.887 |
| 0.7145833333333332 | 7.887 |
| 0.7152777777777778 | 7.887 |
| 0.7159722222222222 | 3.525 |
| 0.7166666666666667 | 3.525 |
| 0.717361111111111 | 3.525 |
| 0.7180555555555556 | 3.525 |
| 0.71875 | 3.525 |
| 0.7194444444444444 | 3.525 |
| 0.720138888888889 | 3.525 |
| 0.7208333333333333 | 3.525 |
| 0.7215277777777778 | 3.525 |
| 0.7222222222222222 | 3.525 |
| 0.7229166666666668 | 0 |
| 0.7236111111111111 | 0 |
| 0.7243055555555555 | 0 |
| 0.725 | 0 |
| 0.7256944444444445 | 0 |
| 0.7263888888888889 | 0 |
| 0.7270833333333333 | 0 |
| 0.7277777777777777 | 0 |
| 0.7284722222222223 | 0 |
| 0.7291666666666666 | 0 |
| 0.7298611111111111 | 0 |
| 0.7305555555555556 | 0 |
| 0.7312500000000001 | 0 |
| 0.7319444444444444 | 0 |
| 0.7326388888888888 | 0 |
| 0.7333333333333334 | 0 |
| 0.7340277777777778 | 0 |
| 0.7347222222222222 | 0 |
| 0.7354166666666666 | 0 |
| 0.7361111111111112 | 0 |
| 0.7368055555555556 | 0 |
| 0.7374999999999999 | 0 |
| 0.7381944444444444 | 0 |
| 0.7388888888888889 | 0 |
| 0.7395833333333334 | 0 |
| 0.7402777777777777 | 0 |
| 0.7409722222222223 | 0 |
| 0.7416666666666667 | 0 |
| 0.7423611111111111 | 0 |
| 0.7430555555555555 | 0 |
| 0.74375 | 0 |
| 0.7444444444444445 | 0 |
| 0.7451388888888889 | 0 |
| 0.7458333333333332 | 0 |
| 0.7465277777777778 | 0 |
| 0.7472222222222222 | 0 |
| 0.7479166666666667 | 0 |
| 0.748611111111111 | 0 |
| 0.7493055555555556 | 0 |
| 0.75 | 0 |
| 0.7506944444444444 | 0 |
| 0.751388888888889 | 0 |
| 0.7520833333333333 | 0 |
| 0.7527777777777778 | 0 |
| 0.7534722222222222 | 0 |
| 0.7541666666666668 | 0 |
| 0.7548611111111111 | 0 |
| 0.7555555555555555 | 0 |
| 0.75625 | 0 |
| 0.7569444444444445 | 0 |
| 0.7576388888888889 | 0 |
| 0.7583333333333333 | 0 |
| 0.7590277777777777 | 0 |
| 0.7597222222222223 | 0 |
| 0.7604166666666666 | 0 |
| 0.7611111111111111 | 0 |
| 0.7618055555555556 | 0 |
| 0.7625000000000001 | 0 |
| 0.7631944444444444 | 0 |
| 0.7638888888888888 | 0 |
| 0.7645833333333334 | 0 |
| 0.7652777777777778 | 0 |
| 0.7659722222222222 | 0 |
| 0.7666666666666666 | 0 |
| 0.7673611111111112 | 0 |
| 0.7680555555555556 | 0 |
| 0.7687499999999999 | 0 |
| 0.7694444444444444 | 0 |
| 0.7701388888888889 | 0 |
| 0.7708333333333334 | 0 |
| 0.7715277777777777 | 0 |
| 0.7722222222222223 | 0 |
| 0.7729166666666667 | 0 |
| 0.7736111111111111 | 0 |
| 0.7743055555555555 | 0 |
| 0.775 | 0 |
| 0.7756944444444445 | 0 |
| 0.7763888888888889 | 0 |
| 0.7770833333333332 | 0 |
| 0.7777777777777778 | 0 |
| 0.7784722222222222 | 0 |
| 0.7791666666666667 | 0 |
| 0.779861111111111 | 0 |
| 0.7805555555555556 | 0 |
| 0.78125 | 0 |
| 0.7819444444444444 | 0 |
| 0.782638888888889 | 0 |
| 0.7833333333333333 | 0 |
| 0.7840277777777778 | 0 |
| 0.7847222222222222 | 0 |
| 0.7854166666666668 | 0 |
| 0.7861111111111111 | 0 |
| 0.7868055555555555 | 0 |
| 0.7875 | 0 |
| 0.7881944444444445 | 0 |
| 0.7888888888888889 | 0 |
| 0.7895833333333333 | 0 |
| 0.7902777777777777 | 0 |
| 0.7909722222222223 | 0 |
| 0.7916666666666666 | 0 |
| 0.7923611111111111 | 0 |
| 0.7930555555555556 | 0 |
| 0.7937500000000001 | 0 |
| 0.7944444444444444 | 0 |
| 0.7951388888888888 | 0 |
| 0.7958333333333334 | 0 |
| 0.7965277777777778 | 0 |
| 0.7972222222222222 | 0 |
| 0.7979166666666666 | 0 |
| 0.7986111111111112 | 0 |
| 0.7993055555555556 | 0 |
| 0.7999999999999999 | 0 |
| 0.8006944444444444 | 0 |
| 0.8013888888888889 | 0 |
| 0.8020833333333334 | 0 |
| 0.8027777777777777 | 0 |
| 0.8034722222222223 | 0 |
| 0.8041666666666667 | 0 |
| 0.8048611111111111 | 0 |
| 0.8055555555555555 | 0 |
| 0.80625 | 0 |
| 0.8069444444444445 | 0 |
| 0.8076388888888889 | 0 |
| 0.8083333333333332 | 0 |
| 0.8090277777777778 | 0 |
| 0.8097222222222222 | 0 |
| 0.8104166666666667 | 0 |
| 0.811111111111111 | 0 |
| 0.8118055555555556 | 0 |
| 0.8125 | 0 |
| 0.8131944444444444 | 0 |
| 0.813888888888889 | 0 |
| 0.8145833333333333 | 0 |
| 0.8152777777777778 | 0 |
| 0.8159722222222222 | 0 |
| 0.8166666666666668 | 0 |
| 0.8173611111111111 | 0 |
| 0.8180555555555555 | 0 |
| 0.81875 | 0 |
| 0.8194444444444445 | 0 |
| 0.8201388888888889 | 0 |
| 0.8208333333333333 | 0 |
| 0.8215277777777777 | 0 |
| 0.8222222222222223 | 0 |
| 0.8229166666666666 | 0 |
| 0.8236111111111111 | 0 |
| 0.8243055555555556 | 0 |
| 0.8250000000000001 | 0 |
| 0.8256944444444444 | 0 |
| 0.8263888888888888 | 0 |
| 0.8270833333333334 | 0 |
| 0.8277777777777778 | 0 |
| 0.8284722222222222 | 0 |
| 0.8291666666666666 | 0 |
| 0.8298611111111112 | 0 |
| 0.8305555555555556 | 0 |
| 0.8312499999999999 | 0 |
| 0.8319444444444444 | 0 |
| 0.8326388888888889 | 0 |
| 0.8333333333333334 | 0 |
| 0.8340277777777777 | 0 |
| 0.8347222222222223 | 0 |
| 0.8354166666666667 | 0 |
| 0.8361111111111111 | 0 |
| 0.8368055555555555 | 0 |
| 0.8375 | 0 |
| 0.8381944444444445 | 0 |
| 0.8388888888888889 | 0 |
| 0.8395833333333332 | 0 |
| 0.8402777777777778 | 0 |
| 0.8409722222222222 | 0 |
| 0.8416666666666667 | 0 |
| 0.842361111111111 | 0 |
| 0.8430555555555556 | 0 |
| 0.84375 | 0 |
| 0.8444444444444444 | 0 |
| 0.845138888888889 | 0 |
| 0.8458333333333333 | 0 |
| 0.8465277777777778 | 0 |
| 0.8472222222222222 | 0 |
| 0.8479166666666668 | 0 |
| 0.8486111111111111 | 0 |
| 0.8493055555555555 | 0 |
| 0.85 | 0 |
| 0.8506944444444445 | 0 |
| 0.8513888888888889 | 0 |
| 0.8520833333333333 | 0 |
| 0.8527777777777777 | 0 |
| 0.8534722222222223 | 0 |
| 0.8541666666666666 | 0 |
| 0.8548611111111111 | 0 |
| 0.8555555555555556 | 0 |
| 0.8562500000000001 | 0 |
| 0.8569444444444444 | 0 |
| 0.8576388888888888 | 0 |
| 0.8583333333333334 | 0 |
| 0.8590277777777778 | 0 |
| 0.8597222222222222 | 0 |
| 0.8604166666666666 | 0 |
| 0.8611111111111112 | 0 |
| 0.8618055555555556 | 0 |
| 0.8624999999999999 | 0 |
| 0.8631944444444444 | 0 |
| 0.8638888888888889 | 0 |
| 0.8645833333333334 | 0 |
| 0.8652777777777777 | 0 |
| 0.8659722222222223 | 0 |
| 0.8666666666666667 | 0 |
| 0.8673611111111111 | 0 |
| 0.8680555555555555 | 0 |
| 0.86875 | 0 |
| 0.8694444444444445 | 0 |
| 0.8701388888888889 | 0 |
| 0.8708333333333332 | 0 |
| 0.8715277777777778 | 0 |
| 0.8722222222222222 | 0 |
| 0.8729166666666667 | 0 |
| 0.873611111111111 | 0 |
| 0.8743055555555556 | 0 |
| 0.875 | 0 |
| 0.8756944444444444 | 0 |
| 0.876388888888889 | 0 |
| 0.8770833333333333 | 0 |
| 0.8777777777777778 | 0 |
| 0.8784722222222222 | 0 |
| 0.8791666666666668 | 0 |
| 0.8798611111111111 | 0 |
| 0.8805555555555555 | 0 |
| 0.88125 | 0 |
| 0.8819444444444445 | 0 |
| 0.8826388888888889 | 0 |
| 0.8833333333333333 | 0 |
| 0.8840277777777777 | 0 |
| 0.8847222222222223 | 0 |
| 0.8854166666666666 | 0 |
| 0.8861111111111111 | 0 |
| 0.8868055555555556 | 0 |
| 0.8875000000000001 | 0 |
| 0.8881944444444444 | 0 |
| 0.8888888888888888 | 0 |
| 0.8895833333333334 | 0 |
| 0.8902777777777778 | 0 |
| 0.8909722222222222 | 0 |
| 0.8916666666666666 | 0 |
| 0.8923611111111112 | 0 |
| 0.8930555555555556 | 0 |
| 0.8937499999999999 | 0 |
| 0.8944444444444444 | 0 |
| 0.8951388888888889 | 0 |
| 0.8958333333333334 | 0 |
| 0.8965277777777777 | 0 |
| 0.8972222222222223 | 0 |
| 0.8979166666666667 | 0 |
| 0.8986111111111111 | 0 |
| 0.8993055555555555 | 0 |
| 0.9 | 0 |
| 0.9006944444444445 | 0 |
| 0.9013888888888889 | 0 |
| 0.9020833333333332 | 0 |
| 0.9027777777777778 | 0 |
| 0.9034722222222222 | 0 |
| 0.9041666666666667 | 0 |
| 0.904861111111111 | 0 |
| 0.9055555555555556 | 0 |
| 0.90625 | 0 |
| 0.9069444444444444 | 0 |
| 0.907638888888889 | 0 |
| 0.9083333333333333 | 0 |
| 0.9090277777777778 | 0 |
| 0.9097222222222222 | 0 |
| 0.9104166666666668 | 0 |
| 0.9111111111111111 | 0 |
| 0.9118055555555555 | 0 |
| 0.9125 | 0 |
| 0.9131944444444445 | 0 |
| 0.9138888888888889 | 0 |
| 0.9145833333333333 | 0 |
| 0.9152777777777777 | 0 |
| 0.9159722222222223 | 0 |
| 0.9166666666666666 | 0 |
| 0.9173611111111111 | 0 |
| 0.9180555555555556 | 0 |
| 0.9187500000000001 | 0 |
| 0.9194444444444444 | 0 |
| 0.9201388888888888 | 0 |
| 0.9208333333333334 | 0 |
| 0.9215277777777778 | 0 |
| 0.9222222222222222 | 0 |
| 0.9229166666666666 | 0 |
| 0.9236111111111112 | 0 |
| 0.9243055555555556 | 0 |
| 0.9249999999999999 | 0 |
| 0.9256944444444444 | 0 |
| 0.9263888888888889 | 0 |
| 0.9270833333333334 | 0 |
| 0.9277777777777777 | 0 |
| 0.9284722222222223 | 0 |
| 0.9291666666666667 | 0 |
| 0.9298611111111111 | 0 |
| 0.9305555555555555 | 0 |
| 0.93125 | 0 |
| 0.9319444444444445 | 0 |
| 0.9326388888888889 | 0 |
| 0.9333333333333332 | 0 |
| 0.9340277777777778 | 0 |
| 0.9347222222222222 | 0 |
| 0.9354166666666667 | 0 |
| 0.936111111111111 | 0 |
| 0.9368055555555556 | 0 |
| 0.9375 | 0 |
| 0.9381944444444444 | 0 |
| 0.938888888888889 | 0 |
| 0.9395833333333333 | 0 |
| 0.9402777777777778 | 0 |
| 0.9409722222222222 | 0 |
| 0.9416666666666668 | 0 |
| 0.9423611111111111 | 0 |
| 0.9430555555555555 | 0 |
| 0.94375 | 0 |
| 0.9444444444444445 | 0 |
| 0.9451388888888889 | 0 |
| 0.9458333333333333 | 0 |
| 0.9465277777777777 | 0 |
| 0.9472222222222223 | 0 |
| 0.9479166666666666 | 0 |
| 0.9486111111111111 | 0 |
| 0.9493055555555556 | 0 |
| 0.9500000000000001 | 0 |
| 0.9506944444444444 | 0 |
| 0.9513888888888888 | 0 |
| 0.9520833333333334 | 0 |
| 0.9527777777777778 | 0 |
| 0.9534722222222222 | 0 |
| 0.9541666666666666 | 0 |
| 0.9548611111111112 | 0 |
| 0.9555555555555556 | 0 |
| 0.9562499999999999 | 0 |
| 0.9569444444444444 | 0 |
| 0.9576388888888889 | 0 |
| 0.9583333333333334 | 0 |
| 0.9590277777777777 | 0 |
| 0.9597222222222223 | 0 |
| 0.9604166666666667 | 0 |
| 0.9611111111111111 | 0 |
| 0.9618055555555555 | 0 |
| 0.9625 | 0 |
| 0.9631944444444445 | 0 |
| 0.9638888888888889 | 0 |
| 0.9645833333333332 | 0 |
| 0.9652777777777778 | 0 |
| 0.9659722222222222 | 0 |
| 0.9666666666666667 | 0 |
| 0.967361111111111 | 0 |
| 0.9680555555555556 | 0 |
| 0.96875 | 0 |
| 0.9694444444444444 | 0 |
| 0.970138888888889 | 0 |
| 0.9708333333333333 | 0 |
| 0.9715277777777778 | 0 |
| 0.9722222222222222 | 0 |
| 0.9729166666666668 | 0 |
| 0.9736111111111111 | 0 |
| 0.9743055555555555 | 0 |
| 0.975 | 0 |
| 0.9756944444444445 | 0 |
| 0.9763888888888889 | 0 |
| 0.9770833333333333 | 0 |
| 0.9777777777777777 | 0 |
| 0.9784722222222223 | 0 |
| 0.9791666666666666 | 0 |
| 0.9798611111111111 | 0 |
| 0.9805555555555556 | 0 |
| 0.9812500000000001 | 0 |
| 0.9819444444444444 | 0 |
| 0.9826388888888888 | 0 |
| 0.9833333333333334 | 0 |
| 0.9840277777777778 | 0 |
| 0.9847222222222222 | 0 |
| 0.9854166666666666 | 0 |
| 0.9861111111111112 | 0 |
| 0.9868055555555556 | 0 |
| 0.9874999999999999 | 0 |
| 0.9881944444444444 | 0 |
| 0.9888888888888889 | 0 |
| 0.9895833333333334 | 0 |
| 0.9902777777777777 | 0 |
| 0.9909722222222223 | 0 |
| 0.9916666666666667 | 0 |
| 0.9923611111111111 | 0 |
| 0.9930555555555555 | 0 |
| 0.99375 | 0 |
| 0.9944444444444445 | 0 |
| 0.9951388888888889 | 0 |
| 0.9958333333333332 | 0 |
| 0.9965277777777778 | 0 |
| 0.9972222222222222 | 0 |
| 0.9979166666666667 | 0 |
| 0.998611111111111 | 0 |
| 0.9993055555555556 | 0 |